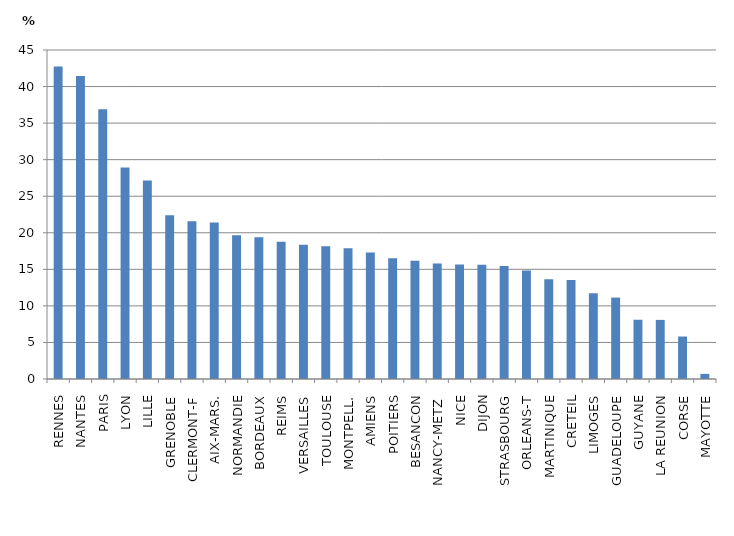
| Category | Part du secteur privé dans le second degré |
|---|---|
| RENNES | 42.74 |
| NANTES | 41.44 |
| PARIS | 36.902 |
| LYON | 28.942 |
| LILLE | 27.144 |
| GRENOBLE | 22.394 |
| CLERMONT-F | 21.575 |
| AIX-MARS. | 21.402 |
| NORMANDIE | 19.658 |
| BORDEAUX | 19.402 |
| REIMS | 18.779 |
| VERSAILLES | 18.359 |
| TOULOUSE | 18.165 |
| MONTPELL. | 17.887 |
| AMIENS | 17.307 |
| POITIERS | 16.509 |
| BESANCON | 16.175 |
| NANCY-METZ  | 15.812 |
| NICE | 15.662 |
| DIJON | 15.612 |
| STRASBOURG | 15.454 |
| ORLEANS-T | 14.825 |
| MARTINIQUE | 13.656 |
| CRETEIL | 13.542 |
| LIMOGES | 11.739 |
| GUADELOUPE | 11.137 |
| GUYANE | 8.106 |
| LA REUNION | 8.086 |
| CORSE | 5.809 |
| MAYOTTE | 0.701 |